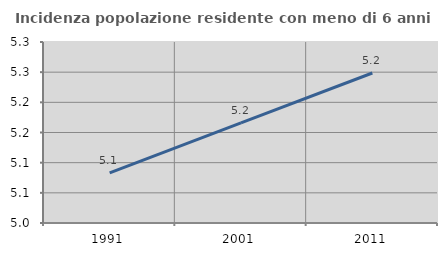
| Category | Incidenza popolazione residente con meno di 6 anni |
|---|---|
| 1991.0 | 5.083 |
| 2001.0 | 5.166 |
| 2011.0 | 5.249 |